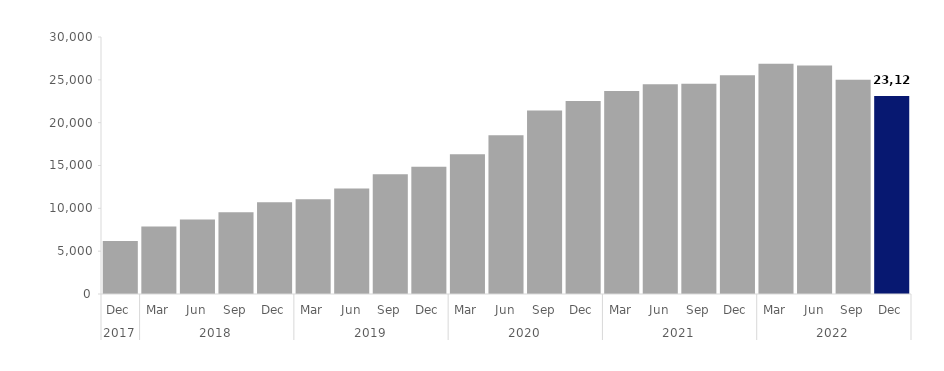
| Category | Series 0 |
|---|---|
| 0 | 6180 |
| 1 | 7890 |
| 2 | 8703 |
| 3 | 9537 |
| 4 | 10713 |
| 5 | 11067 |
| 6 | 12309 |
| 7 | 13965 |
| 8 | 14868 |
| 9 | 16308 |
| 10 | 18522 |
| 11 | 21414 |
| 12 | 22521 |
| 13 | 23688 |
| 14 | 24474 |
| 15 | 24546 |
| 16 | 25524 |
| 17 | 26868 |
| 18 | 26664 |
| 19 | 24996 |
| 20 | 23127 |